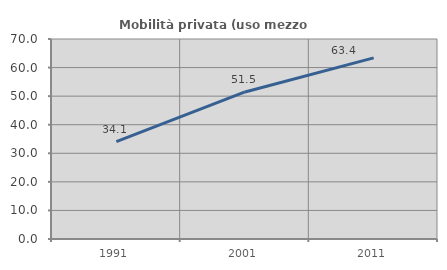
| Category | Mobilità privata (uso mezzo privato) |
|---|---|
| 1991.0 | 34.06 |
| 2001.0 | 51.473 |
| 2011.0 | 63.388 |